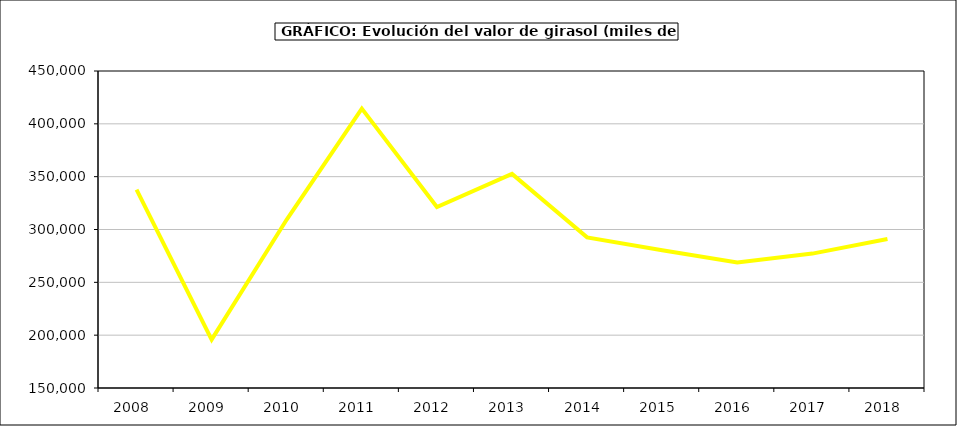
| Category | Valor |
|---|---|
| 2008.0 | 337817.138 |
| 2009.0 | 195820.408 |
| 2010.0 | 309453.606 |
| 2011.0 | 414373.997 |
| 2012.0 | 321265.307 |
| 2013.0 | 352632.719 |
| 2014.0 | 292566.702 |
| 2015.0 | 280295 |
| 2016.0 | 268873 |
| 2017.0 | 277184.982 |
| 2018.0 | 291090.98 |